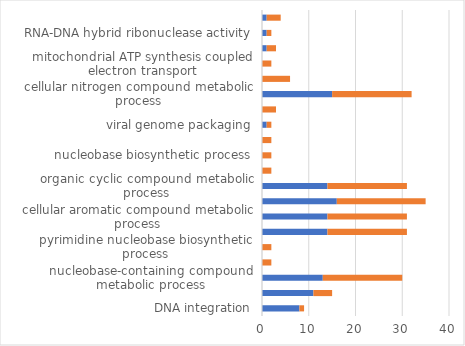
| Category | up | down |
|---|---|---|
| DNA integration | 8 | 1 |
| DNA metabolic process | 11 | 4 |
| nucleobase-containing compound metabolic process | 13 | 17 |
| pyrimidine nucleobase metabolic process | 0 | 2 |
| pyrimidine nucleobase biosynthetic process | 0 | 2 |
| heterocycle metabolic process | 14 | 17 |
| cellular aromatic compound metabolic process | 14 | 17 |
| nitrogen compound metabolic process | 16 | 19 |
| organic cyclic compound metabolic process | 14 | 17 |
| nucleobase metabolic process | 0 | 2 |
| nucleobase biosynthetic process | 0 | 2 |
| mitochondrial electron transport, NADH to ubiquinone | 0 | 2 |
| viral genome packaging | 1 | 1 |
| electron transport chain | 0 | 3 |
| cellular nitrogen compound metabolic process | 15 | 17 |
| nucleobase-containing small molecule metabolic process | 0 | 6 |
| mitochondrial ATP synthesis coupled electron transport | 0 | 2 |
| heme-copper terminal oxidase activity | 1 | 2 |
| RNA-DNA hybrid ribonuclease activity | 1 | 1 |
| aspartic-type endopeptidase activity | 1 | 3 |